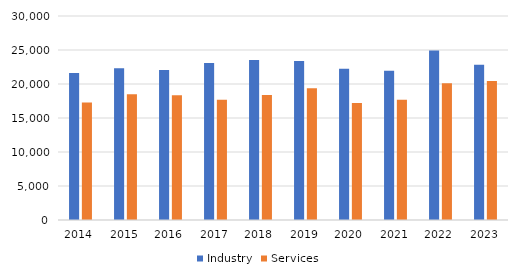
| Category | Industry | Services |
|---|---|---|
| 2014.0 | 21626 | 17284 |
| 2015.0 | 22315 | 18498 |
| 2016.0 | 22072 | 18338 |
| 2017.0 | 23077 | 17688 |
| 2018.0 | 23544 | 18366 |
| 2019.0 | 23392 | 19370 |
| 2020.0 | 22235 | 17212 |
| 2021.0 | 21953 | 17695 |
| 2022.0 | 24937 | 20120 |
| 2023.0 | 22834 | 20450 |